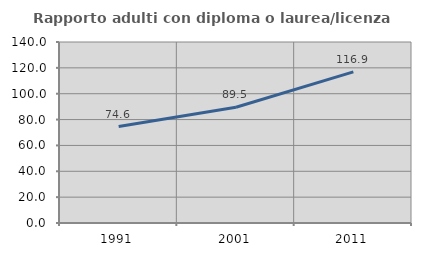
| Category | Rapporto adulti con diploma o laurea/licenza media  |
|---|---|
| 1991.0 | 74.635 |
| 2001.0 | 89.534 |
| 2011.0 | 116.891 |